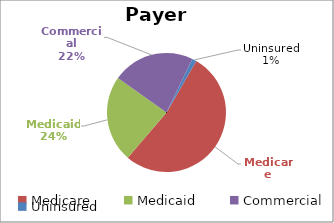
| Category | Series 0 |
|---|---|
| Medicare | 0.529 |
| Medicaid  | 0.235 |
| Commercial | 0.224 |
| Uninsured | 0.012 |